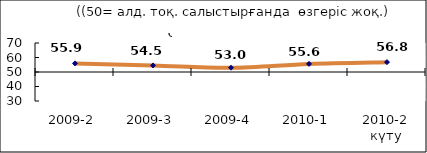
| Category | Диф.индекс ↓ |
|---|---|
| 2009-2 | 55.93 |
| 2009-3 | 54.535 |
| 2009-4 | 52.96 |
| 2010-1 | 55.59 |
| 2010-2 күту | 56.8 |